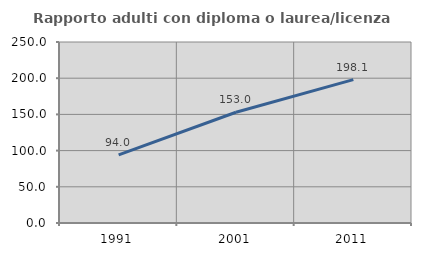
| Category | Rapporto adulti con diploma o laurea/licenza media  |
|---|---|
| 1991.0 | 94.048 |
| 2001.0 | 152.991 |
| 2011.0 | 198.089 |